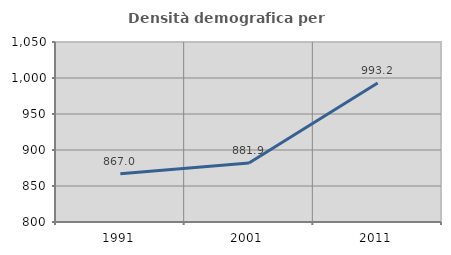
| Category | Densità demografica |
|---|---|
| 1991.0 | 866.96 |
| 2001.0 | 881.867 |
| 2011.0 | 993.16 |